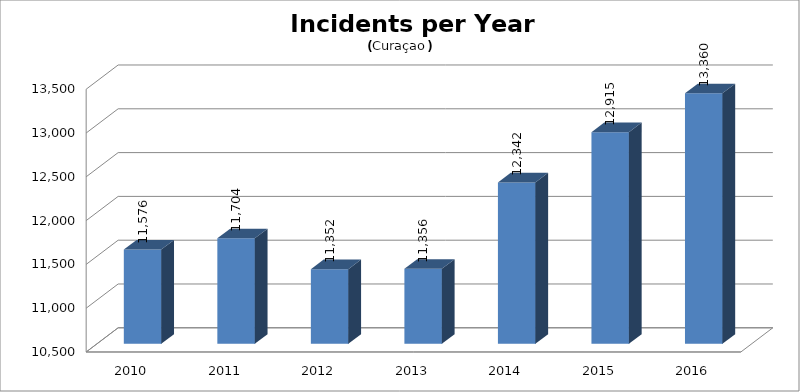
| Category | Series 0 |
|---|---|
| 2010.0 | 11576 |
| 2011.0 | 11704 |
| 2012.0 | 11352 |
| 2013.0 | 11356 |
| 2014.0 | 12342 |
| 2015.0 | 12915 |
| 2016.0 | 13360 |